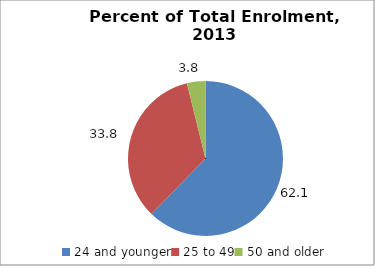
| Category | Series 0 |
|---|---|
| 24 and younger | 62.112 |
| 25 to 49 | 33.791 |
| 50 and older | 3.848 |